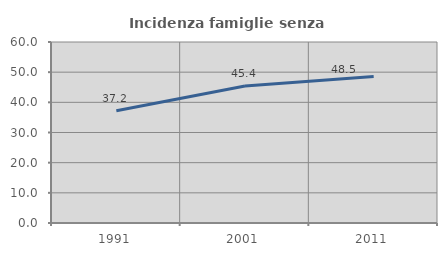
| Category | Incidenza famiglie senza nuclei |
|---|---|
| 1991.0 | 37.2 |
| 2001.0 | 45.387 |
| 2011.0 | 48.54 |